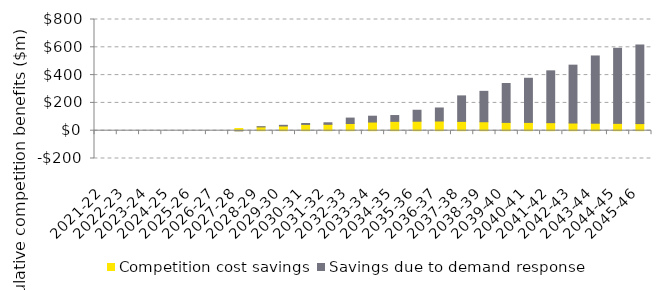
| Category | Competition cost savings | Savings due to demand response |
|---|---|---|
| 2021-22 | 0 | 0 |
| 2022-23 | 0 | 0 |
| 2023-24 | 0 | 0 |
| 2024-25 | 0 | 0 |
| 2025-26 | 0 | 0 |
| 2026-27 | 0 | 0 |
| 2027-28 | 15.502 | -1.029 |
| 2028-29 | 27.168 | 1.636 |
| 2029-30 | 33.917 | 4.793 |
| 2030-31 | 45.114 | 6.773 |
| 2031-32 | 45.956 | 10.983 |
| 2032-33 | 51.99 | 38.819 |
| 2033-34 | 62.27 | 42.03 |
| 2034-35 | 67.091 | 42.06 |
| 2035-36 | 68.06 | 79.076 |
| 2036-37 | 69.704 | 93.757 |
| 2037-38 | 67.06 | 183.398 |
| 2038-39 | 64.518 | 218.59 |
| 2039-40 | 59.638 | 280.081 |
| 2040-41 | 59.565 | 317.617 |
| 2041-42 | 57.754 | 372.833 |
| 2042-43 | 55.249 | 416.223 |
| 2043-44 | 53.848 | 483.827 |
| 2044-45 | 52.808 | 540.038 |
| 2045-46 | 51.178 | 565.425 |